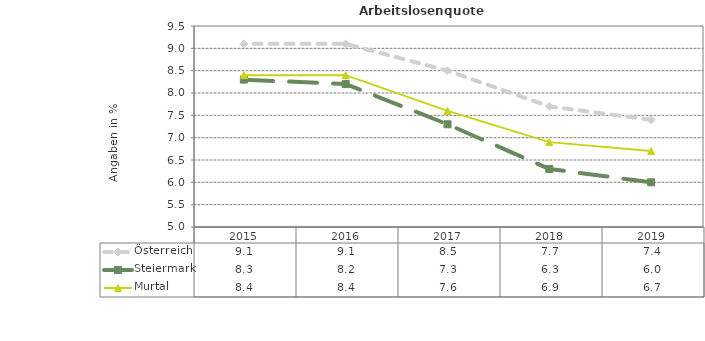
| Category | Österreich | Steiermark | Murtal |
|---|---|---|---|
| 2019.0 | 7.4 | 6 | 6.7 |
| 2018.0 | 7.7 | 6.3 | 6.9 |
| 2017.0 | 8.5 | 7.3 | 7.6 |
| 2016.0 | 9.1 | 8.2 | 8.4 |
| 2015.0 | 9.1 | 8.3 | 8.4 |